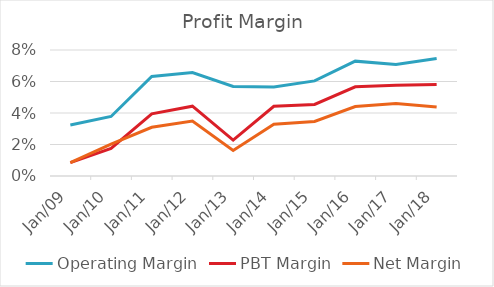
| Category | Operating Margin | PBT Margin | Net Margin |
|---|---|---|---|
| Mar-09 | 0.032 | 0.008 | 0.008 |
| Mar-10 | 0.038 | 0.017 | 0.02 |
| Mar-11 | 0.063 | 0.039 | 0.031 |
| Mar-12 | 0.066 | 0.044 | 0.035 |
| Mar-13 | 0.057 | 0.023 | 0.016 |
| Mar-14 | 0.056 | 0.044 | 0.033 |
| Mar-15 | 0.06 | 0.045 | 0.035 |
| Mar-16 | 0.073 | 0.057 | 0.044 |
| Mar-17 | 0.071 | 0.058 | 0.046 |
| Mar-18 | 0.075 | 0.058 | 0.044 |